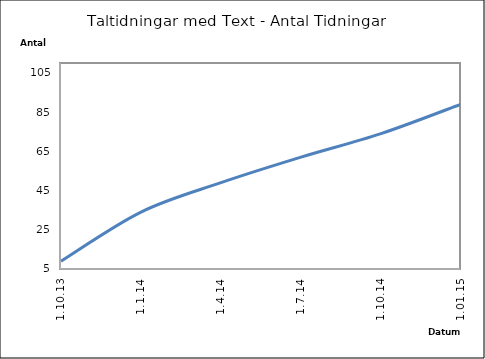
| Category | Series 0 |
|---|---|
| 1.10.13 | 9 |
| 1.1.14 | 34 |
| 1.4.14 | 49 |
| 1.7.14 | 62 |
| 1.10.14 | 74 |
| 1.01.15 | 89 |